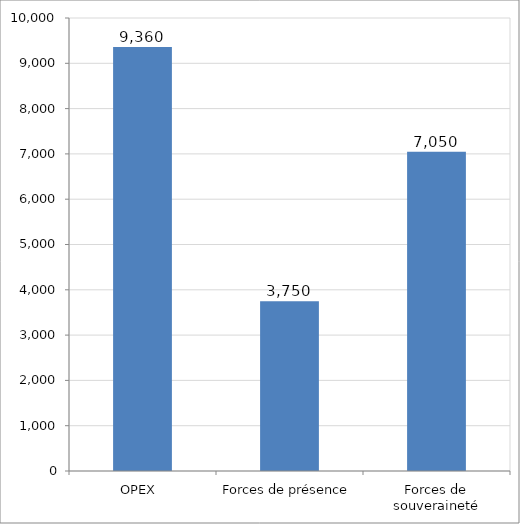
| Category | Series 0 |
|---|---|
| OPEX  | 9360 |
| Forces de présence | 3750 |
| Forces de souveraineté | 7050 |